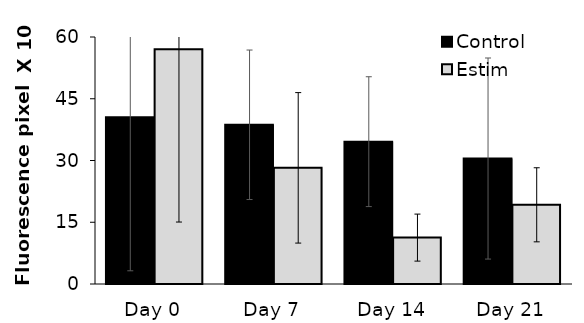
| Category | Control | Estim |
|---|---|---|
| 0 | 40485459.178 | 57036871.111 |
| 1 | 38676033.833 | 28215709.752 |
| 2 | 34576899.911 | 11269039.489 |
| 3 | 30477376.911 | 19239843.711 |